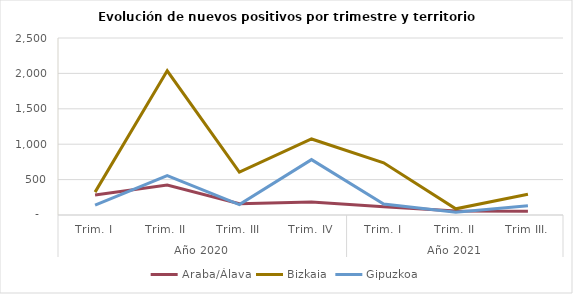
| Category | Araba/Álava | Bizkaia | Gipuzkoa |
|---|---|---|---|
| 0 | 284 | 323 | 138 |
| 1 | 422 | 2036 | 556 |
| 2 | 160 | 604 | 148 |
| 3 | 182 | 1074 | 782 |
| 4 | 116 | 737 | 156 |
| 5 | 55 | 87 | 40 |
| 6 | 54 | 294 | 129 |